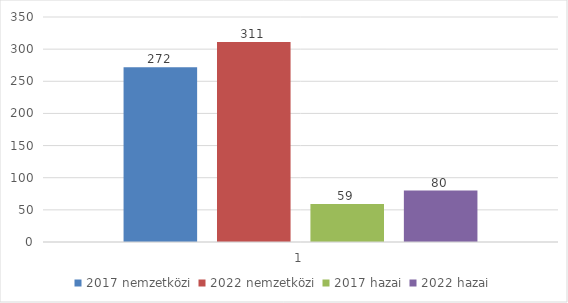
| Category | 2017 nemzetközi | 2022 nemzetközi | 2017 hazai | 2022 hazai |
|---|---|---|---|---|
| 0 | 272 | 311 | 59 | 80 |